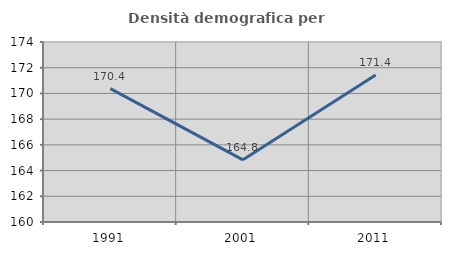
| Category | Densità demografica |
|---|---|
| 1991.0 | 170.378 |
| 2001.0 | 164.834 |
| 2011.0 | 171.437 |